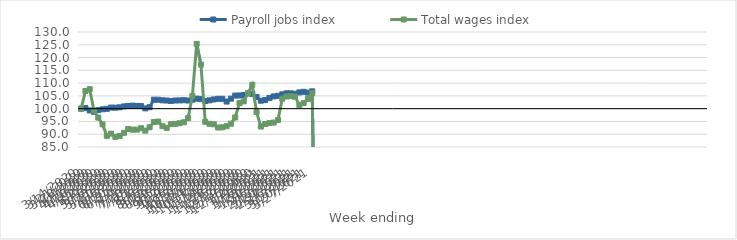
| Category | Payroll jobs index | Total wages index |
|---|---|---|
| 14/03/2020 | 100 | 100 |
| 21/03/2020 | 100.224 | 106.908 |
| 28/03/2020 | 99.318 | 107.622 |
| 04/04/2020 | 98.779 | 99.277 |
| 11/04/2020 | 99.413 | 96.523 |
| 18/04/2020 | 99.757 | 93.857 |
| 25/04/2020 | 99.931 | 89.355 |
| 02/05/2020 | 100.422 | 90.228 |
| 09/05/2020 | 100.392 | 88.97 |
| 16/05/2020 | 100.518 | 89.328 |
| 23/05/2020 | 100.879 | 90.551 |
| 30/05/2020 | 101.058 | 92.06 |
| 06/06/2020 | 101.176 | 91.789 |
| 13/06/2020 | 101.078 | 91.793 |
| 20/06/2020 | 101.007 | 92.365 |
| 27/06/2020 | 100.114 | 91.401 |
| 04/07/2020 | 100.582 | 92.724 |
| 11/07/2020 | 103.497 | 94.774 |
| 18/07/2020 | 103.497 | 94.943 |
| 25/07/2020 | 103.271 | 93.153 |
| 01/08/2020 | 103.18 | 92.492 |
| 08/08/2020 | 103.023 | 93.934 |
| 15/08/2020 | 103.201 | 94.05 |
| 22/08/2020 | 103.232 | 94.304 |
| 29/08/2020 | 103.313 | 94.668 |
| 05/09/2020 | 103.189 | 96.3 |
| 12/09/2020 | 103.52 | 104.991 |
| 19/09/2020 | 103.923 | 125.355 |
| 26/09/2020 | 103.737 | 117.234 |
| 03/10/2020 | 102.999 | 94.868 |
| 10/10/2020 | 103.255 | 94.051 |
| 17/10/2020 | 103.611 | 93.875 |
| 24/10/2020 | 103.851 | 92.622 |
| 31/10/2020 | 103.85 | 92.708 |
| 07/11/2020 | 102.78 | 93.137 |
| 14/11/2020 | 103.916 | 94.106 |
| 21/11/2020 | 105.119 | 96.546 |
| 28/11/2020 | 105.161 | 102.156 |
| 05/12/2020 | 105.347 | 102.862 |
| 12/12/2020 | 105.976 | 106.092 |
| 19/12/2020 | 105.786 | 109.323 |
| 26/12/2020 | 104.543 | 98.665 |
| 02/01/2021 | 103.108 | 93 |
| 09/01/2021 | 103.366 | 93.977 |
| 16/01/2021 | 104.201 | 94.344 |
| 23/01/2021 | 104.8 | 94.563 |
| 30/01/2021 | 105.014 | 95.547 |
| 06/02/2021 | 105.607 | 103.899 |
| 13/02/2021 | 106.008 | 104.769 |
| 20/02/2021 | 105.996 | 104.887 |
| 27/02/2021 | 105.823 | 104.702 |
| 06/03/2021 | 106.365 | 101.382 |
| 13/03/2021 | 106.605 | 102.182 |
| 20/03/2021 | 106.28 | 103.774 |
| 27/03/2021 | 106.785 | 106.033 |